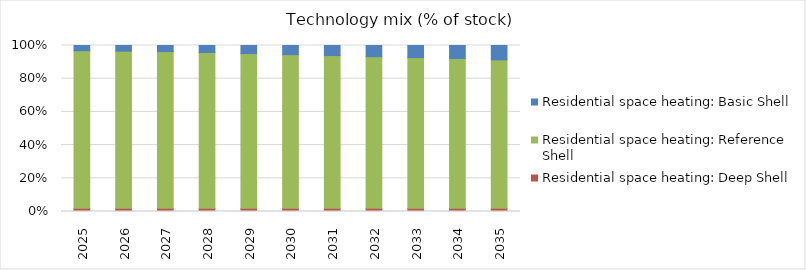
| Category | Residential space heating: Deep Shell | Residential space heating: Reference Shell | Residential space heating: Basic Shell |
|---|---|---|---|
| 2025.0 | 0.019 | 0.949 | 0.032 |
| 2026.0 | 0.019 | 0.947 | 0.034 |
| 2027.0 | 0.019 | 0.944 | 0.037 |
| 2028.0 | 0.019 | 0.938 | 0.042 |
| 2029.0 | 0.019 | 0.932 | 0.049 |
| 2030.0 | 0.019 | 0.926 | 0.055 |
| 2031.0 | 0.019 | 0.92 | 0.061 |
| 2032.0 | 0.019 | 0.913 | 0.068 |
| 2033.0 | 0.019 | 0.908 | 0.073 |
| 2034.0 | 0.019 | 0.903 | 0.078 |
| 2035.0 | 0.019 | 0.894 | 0.087 |